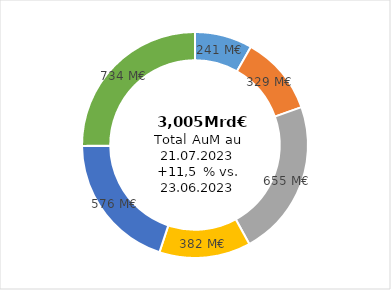
| Category | Series 0 |
|---|---|
| BBB+ | 0.08 |
| BBB | 0.11 |
| BBB- | 0.218 |
| BB+ | 0.127 |
| BB | 0.192 |
| BB- | 0.244 |